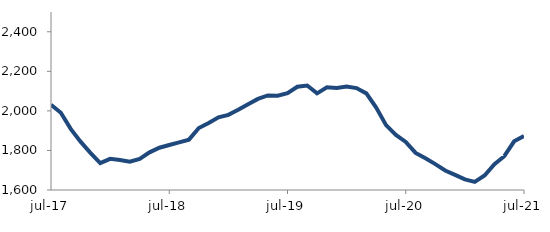
| Category | Series 0 |
|---|---|
| 2017-07-01 | 2030.99 |
| 2017-08-01 | 1990.738 |
| 2017-09-01 | 1908.873 |
| 2017-10-01 | 1844.49 |
| 2017-11-01 | 1788.112 |
| 2017-12-01 | 1736.148 |
| 2018-01-01 | 1757.409 |
| 2018-02-01 | 1751.839 |
| 2018-03-01 | 1742.835 |
| 2018-04-01 | 1757.68 |
| 2018-05-01 | 1790.41 |
| 2018-06-01 | 1813.611 |
| 2018-07-01 | 1827.454 |
| 2018-08-01 | 1840.806 |
| 2018-09-01 | 1854.733 |
| 2018-10-01 | 1913.472 |
| 2018-11-01 | 1938.819 |
| 2018-12-01 | 1967.481 |
| 2019-01-01 | 1980.122 |
| 2019-02-01 | 2005.664 |
| 2019-03-01 | 2033.637 |
| 2019-04-01 | 2060.76 |
| 2019-05-01 | 2078.07 |
| 2019-06-01 | 2076.377 |
| 2019-07-01 | 2089.152 |
| 2019-08-01 | 2121.901 |
| 2019-09-01 | 2128.491 |
| 2019-10-01 | 2088.553 |
| 2019-11-01 | 2119.211 |
| 2019-12-01 | 2116.27 |
| 2020-01-01 | 2123.179 |
| 2020-02-01 | 2115.217 |
| 2020-03-01 | 2088.6 |
| 2020-04-01 | 2017.196 |
| 2020-05-01 | 1928.056 |
| 2020-06-01 | 1878.793 |
| 2020-07-01 | 1843.079 |
| 2020-08-01 | 1787.318 |
| 2020-09-01 | 1760.041 |
| 2020-10-01 | 1730.797 |
| 2020-11-01 | 1698.405 |
| 2020-12-01 | 1676.693 |
| 2021-01-01 | 1653.561 |
| 2021-02-01 | 1641.346 |
| 2021-03-01 | 1673.136 |
| 2021-04-01 | 1730.094 |
| 2021-05-01 | 1770.762 |
| 2021-06-01 | 1846.016 |
| 2021-07-01 | 1873.56 |